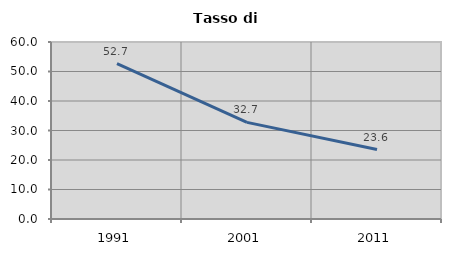
| Category | Tasso di disoccupazione   |
|---|---|
| 1991.0 | 52.675 |
| 2001.0 | 32.75 |
| 2011.0 | 23.557 |